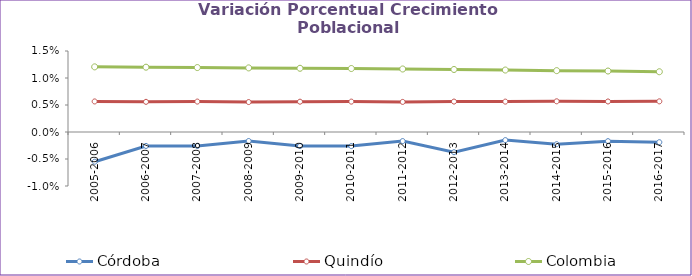
| Category | Córdoba | Quindío | Colombia |
|---|---|---|---|
| 2005-2006 | -0.006 | 0.006 | 0.012 |
| 2006-2007 | -0.003 | 0.006 | 0.012 |
| 2007-2008 | -0.003 | 0.006 | 0.012 |
| 2008-2009 | -0.002 | 0.006 | 0.012 |
| 2009-2010 | -0.003 | 0.006 | 0.012 |
| 2010-2011 | -0.003 | 0.006 | 0.012 |
| 2011-2012 | -0.002 | 0.006 | 0.012 |
| 2012-2013 | -0.004 | 0.006 | 0.012 |
| 2013-2014 | -0.002 | 0.006 | 0.011 |
| 2014-2015 | -0.002 | 0.006 | 0.011 |
| 2015-2016 | -0.002 | 0.006 | 0.011 |
| 2016-2017 | -0.002 | 0.006 | 0.011 |